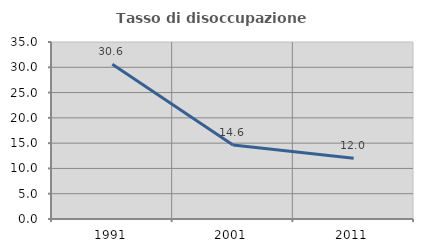
| Category | Tasso di disoccupazione giovanile  |
|---|---|
| 1991.0 | 30.612 |
| 2001.0 | 14.634 |
| 2011.0 | 12 |